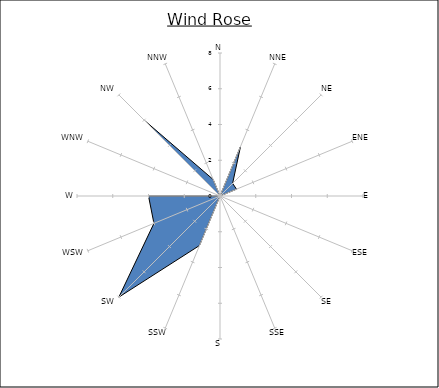
| Category | Series 0 |
|---|---|
| N | 0 |
| NNE | 3 |
| NE | 1 |
| ENE | 1 |
| E | 0 |
| ESE | 0 |
| SE | 0 |
| SSE | 0 |
| S | 0 |
| SSW | 3 |
| SW | 8 |
| WSW | 4 |
| W | 4 |
| WNW | 0 |
| NW | 6 |
| NNW | 1 |